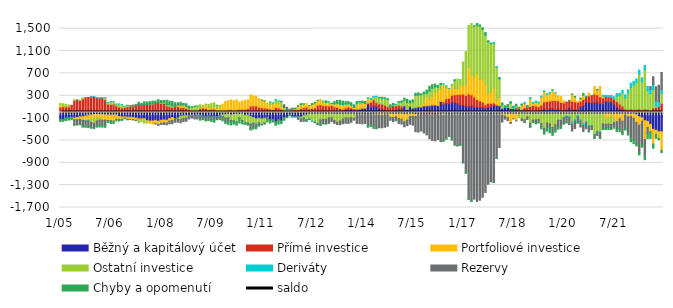
| Category | Běžný a kapitálový účet | Přímé investice | Portfoliové investice | Ostatní investice | Deriváty | Rezervy | Chyby a opomenutí |
|---|---|---|---|---|---|---|---|
| 2005-01-01 | -124.441 | 95.969 | 39.087 | 26.806 | -3.065 | -5.26 | -29.096 |
| 2005-02-01 | -122.296 | 106.451 | 15.114 | 35.964 | -2.865 | -3.918 | -28.449 |
| 2005-03-01 | -100.116 | 102.116 | 6.391 | 36.628 | -2.888 | -3.167 | -38.963 |
| 2005-04-01 | -90.744 | 102.48 | 2.986 | 29.42 | -4.783 | -6.772 | -32.587 |
| 2005-05-01 | -89.679 | 128.07 | -3.823 | -2.079 | -5.604 | -5.721 | -21.164 |
| 2005-06-01 | -96.933 | 213.928 | -31.807 | 14.9 | -7.103 | -88.045 | -4.94 |
| 2005-07-01 | -88.549 | 221.495 | -40.71 | -0.842 | -6.275 | -86.563 | 1.444 |
| 2005-08-01 | -77.137 | 212.773 | -43.483 | 6.714 | -6.537 | -89.944 | -2.386 |
| 2005-09-01 | -73.567 | 242.95 | -64.269 | 20.836 | -5.857 | -90.117 | -29.976 |
| 2005-10-01 | -62.91 | 265.013 | -77.21 | -7.197 | -4.649 | -90.105 | -22.942 |
| 2005-11-01 | -48.904 | 269.98 | -71.257 | -26.77 | -3.361 | -92.488 | -27.198 |
| 2005-12-01 | -44.466 | 279.63 | -81.187 | -52.224 | 0.188 | -92.851 | -9.091 |
| 2006-01-01 | -35.444 | 286.612 | -77.386 | -82.044 | 0.334 | -88.37 | -3.702 |
| 2006-02-01 | -32.147 | 261.427 | -60.913 | -57.207 | 0.355 | -92.35 | -19.166 |
| 2006-03-01 | -36.206 | 259.906 | -66.476 | -31.709 | 0.352 | -90.272 | -35.595 |
| 2006-04-01 | -38.805 | 261.891 | -82.916 | -18.61 | 0.424 | -86.38 | -35.603 |
| 2006-05-01 | -42.031 | 226.242 | -94.803 | 38.443 | 0.405 | -87.108 | -41.149 |
| 2006-06-01 | -44.576 | 146.85 | -99.523 | 30.924 | 0.366 | -5.548 | -28.492 |
| 2006-07-01 | -48.513 | 145.409 | -99.489 | 49.973 | 0.44 | -6.593 | -41.226 |
| 2006-08-01 | -46.557 | 148.445 | -108.886 | 47.854 | 0.452 | -6.15 | -35.158 |
| 2006-09-01 | -45.66 | 119.059 | -76.938 | 29.42 | 0.458 | -5.379 | -20.96 |
| 2006-10-01 | -73.871 | 97.411 | -49.213 | 54.007 | 0.541 | -7.077 | -21.796 |
| 2006-11-01 | -78.121 | 82.298 | -45.066 | 59.653 | 0.578 | -4.684 | -14.658 |
| 2006-12-01 | -75.212 | 90.262 | -26.882 | 20.925 | 0.679 | -2.075 | -7.696 |
| 2007-01-01 | -83.423 | 101.253 | -38.198 | 27.914 | 0.347 | -6.558 | -1.335 |
| 2007-02-01 | -84.812 | 110.884 | -37.352 | 5.205 | 0.448 | -0.928 | 6.556 |
| 2007-03-01 | -87.759 | 119.2 | -42.444 | 2.9 | 0.651 | -2.222 | 9.675 |
| 2007-04-01 | -98.952 | 125.496 | -20.046 | -24.529 | 0.603 | -1.944 | 19.374 |
| 2007-05-01 | -115.181 | 140.267 | -0.424 | -67.889 | 0.571 | 3.145 | 39.512 |
| 2007-06-01 | -111.686 | 132.066 | -13.346 | -38.819 | 0.383 | 5.255 | 26.147 |
| 2007-07-01 | -110.629 | 139.899 | -17.679 | -62.691 | 0.819 | 5.975 | 44.306 |
| 2007-08-01 | -145.936 | 146.494 | -28.978 | -12.535 | 0.999 | 3.072 | 36.885 |
| 2007-09-01 | -153.084 | 142.552 | -41.157 | 10.856 | 1.127 | 2.524 | 37.18 |
| 2007-10-01 | -151.952 | 148.301 | -52.926 | 6.14 | 1.324 | 1.454 | 47.66 |
| 2007-11-01 | -140.913 | 169.558 | -46.7 | -12.052 | 1.439 | -4.989 | 33.657 |
| 2007-12-01 | -155.189 | 179.064 | -58.258 | 4.625 | 1.297 | -15.666 | 44.127 |
| 2008-01-01 | -139.155 | 162.969 | -50.423 | 13.634 | 1.767 | -23.652 | 34.859 |
| 2008-02-01 | -132.842 | 162.76 | -50.101 | 16.257 | 2.075 | -32.474 | 34.324 |
| 2008-03-01 | -137.494 | 118.698 | -47.643 | 19.909 | 1.501 | -34.244 | 79.272 |
| 2008-04-01 | -107.244 | 104.523 | -43.151 | 34.588 | 1.689 | -53.309 | 62.904 |
| 2008-05-01 | -89.527 | 91.732 | -53.819 | 26.557 | 1.924 | -56.774 | 79.906 |
| 2008-06-01 | -112.332 | 113.068 | -1.37 | 0.386 | 3.156 | -60.286 | 57.377 |
| 2008-07-01 | -98.433 | 104.608 | 24.023 | -16.001 | 2.504 | -59.112 | 42.41 |
| 2008-08-01 | -65.04 | 85.821 | 43.933 | -59.607 | 1.553 | -59.348 | 52.687 |
| 2008-09-01 | -58.791 | 87.331 | 47.4 | -47.509 | 1.636 | -56.478 | 26.412 |
| 2008-10-01 | -56.607 | 74.424 | 35.608 | -41.803 | 1.578 | -57.768 | 44.569 |
| 2008-11-01 | -61.103 | 53.223 | -7.622 | 24.032 | -0.127 | -47.052 | 38.648 |
| 2008-12-01 | -49.23 | 36.327 | -9.146 | 58.766 | -2.607 | -40.111 | 6.001 |
| 2009-01-01 | -65.644 | 34.981 | -6.533 | 68.796 | -3.869 | -39.448 | 11.717 |
| 2009-02-01 | -47.079 | 33.476 | -5.426 | 82.017 | -5.137 | -59.391 | 1.54 |
| 2009-03-01 | -57.657 | 76.496 | 2.846 | 59.438 | -4.729 | -56.897 | -19.497 |
| 2009-04-01 | -63.743 | 78.011 | 16.979 | 33.12 | -4.444 | -45.707 | -14.217 |
| 2009-05-01 | -77.985 | 71.53 | 69.517 | 9.818 | -5.037 | -50.088 | -17.755 |
| 2009-06-01 | -65.636 | 52.724 | 37.762 | 54.86 | -5.444 | -45.396 | -28.868 |
| 2009-07-01 | -70.456 | 56.607 | 23.473 | 81.424 | -5.5 | -50.881 | -34.667 |
| 2009-08-01 | -75.834 | 60.436 | 37.65 | 75.148 | -4.999 | -42.508 | -49.894 |
| 2009-09-01 | -80.317 | 19.168 | 53.25 | 56.442 | -5.31 | -43.295 | 0.062 |
| 2009-10-01 | -50.64 | 16.017 | 84.549 | 27.42 | -6.32 | -44.017 | -27.01 |
| 2009-11-01 | -43.565 | 25.287 | 124.379 | -23.687 | -3.981 | -52.899 | -25.534 |
| 2009-12-01 | -37.928 | 37.694 | 158.688 | -62.101 | -1.288 | -60.646 | -34.419 |
| 2010-01-01 | -23.312 | 44.096 | 167.271 | -72.935 | -0.918 | -57.35 | -56.851 |
| 2010-02-01 | -44.444 | 51.441 | 172.535 | -96.436 | -0.658 | -24.165 | -58.272 |
| 2010-03-01 | -35.774 | 35.109 | 173.365 | -113.51 | -1.262 | -17.66 | -40.267 |
| 2010-04-01 | -24.486 | 40.28 | 186.135 | -146.14 | -1.347 | -8.814 | -45.628 |
| 2010-05-01 | -27.913 | 54.679 | 132.614 | -71.933 | -0.566 | -11.516 | -75.366 |
| 2010-06-01 | -7.947 | 56.225 | 148.714 | -133.05 | -0.789 | -14.791 | -48.362 |
| 2010-07-01 | -50.09 | 56.216 | 156.042 | -133.579 | -0.924 | -14.636 | -13.028 |
| 2010-08-01 | -47.156 | 67.767 | 158.203 | -138.067 | -1.091 | -27.99 | -11.666 |
| 2010-09-01 | -69.148 | 111 | 202.812 | -139.799 | -1.329 | -77.548 | -25.988 |
| 2010-10-01 | -89.776 | 119.635 | 177.882 | -101.974 | -1.563 | -68.884 | -35.32 |
| 2010-11-01 | -113.162 | 117.523 | 172.315 | -95.285 | -3.495 | -47.139 | -30.757 |
| 2010-12-01 | -104.18 | 94.99 | 150.353 | -76.832 | -4.748 | -41.425 | -18.159 |
| 2011-01-01 | -112.249 | 85.701 | 136.06 | -100.04 | -3.121 | -7.374 | 1.021 |
| 2011-02-01 | -102.287 | 80.335 | 127.736 | -86.588 | -1.586 | -18.566 | 0.957 |
| 2011-03-01 | -97.652 | 72.662 | 96.809 | -11.906 | -0.433 | -21.448 | -38.032 |
| 2011-04-01 | -124.856 | 61.899 | 72.974 | 51.933 | 1.134 | -23.294 | -39.792 |
| 2011-05-01 | -124.383 | 56.516 | 92.859 | 18.459 | 2.241 | -18.176 | -27.516 |
| 2011-06-01 | -164.887 | 90.626 | 76.627 | 58.552 | 4 | -20.423 | -44.494 |
| 2011-07-01 | -127.374 | 81.742 | 69.82 | 52.031 | 3.104 | -16.155 | -63.168 |
| 2011-08-01 | -144.867 | 61.807 | 42.247 | 93.574 | 1.908 | 0.029 | -54.698 |
| 2011-09-01 | -98.512 | 17.782 | -3.278 | 73.351 | 2.511 | 45.365 | -37.218 |
| 2011-10-01 | -81.308 | 12.681 | 0.923 | 40.645 | 2.323 | 36.939 | -12.202 |
| 2011-11-01 | -48.288 | 11.716 | 9.042 | 29.031 | -0.428 | 12.876 | -13.948 |
| 2011-12-01 | -72.091 | 46.805 | 5.781 | 8.622 | -3.673 | 17.23 | -2.673 |
| 2012-01-01 | -71.765 | 49.424 | 10.666 | 6.27 | -4.179 | -2.599 | 12.183 |
| 2012-02-01 | -79.424 | 50.592 | 59.164 | -10.81 | -1.836 | -30.201 | 12.516 |
| 2012-03-01 | -82.403 | 71.489 | 70.983 | -33.775 | -1.37 | -42.191 | 17.268 |
| 2012-04-01 | -55.856 | 83.434 | 66.434 | -42.772 | -3.649 | -55.377 | 7.786 |
| 2012-05-01 | -47.814 | 97.272 | 62.13 | -80.113 | -5.98 | -11.629 | -13.865 |
| 2012-06-01 | -4.534 | 68.001 | 56.551 | -107.547 | -9.458 | -4.086 | 1.074 |
| 2012-07-01 | -9.854 | 74.813 | 69.95 | -142.421 | -8.184 | 0.337 | 15.359 |
| 2012-08-01 | -2.597 | 81.568 | 85.993 | -168.212 | -6.378 | -6.409 | 16.036 |
| 2012-09-01 | -22.78 | 129.537 | 86.466 | -175.565 | -3.162 | -16.106 | 1.609 |
| 2012-10-01 | -1.424 | 136.501 | 94.815 | -133.195 | -0.024 | -82.175 | -14.498 |
| 2012-11-01 | -2.02 | 123.145 | 76.137 | -120.867 | 5.046 | -75.302 | -6.139 |
| 2012-12-01 | -10.302 | 121.261 | 54.848 | -115.942 | 8.618 | -80.474 | 21.991 |
| 2013-01-01 | -7.036 | 117.217 | 73.375 | -90.463 | 7.59 | -98.023 | -2.66 |
| 2013-02-01 | 13.966 | 112.128 | 32.087 | -96.088 | 4.273 | -69.024 | 2.658 |
| 2013-03-01 | -19.176 | 103.112 | 48.504 | -123.155 | 3.833 | -53.451 | 40.333 |
| 2013-04-01 | -22.668 | 92.047 | 70.258 | -153.123 | 4.515 | -39.026 | 47.997 |
| 2013-05-01 | -16.681 | 72.891 | 73.219 | -135.312 | 5.105 | -66.757 | 67.535 |
| 2013-06-01 | -14.434 | 56.612 | 80.987 | -104.838 | 7.726 | -82.522 | 56.469 |
| 2013-07-01 | 35.854 | 46.634 | 64.673 | -98.53 | 8.072 | -94.98 | 38.278 |
| 2013-08-01 | 51.942 | 44.252 | 54.412 | -101.583 | 8.101 | -94.924 | 37.8 |
| 2013-09-01 | 54.846 | 28.419 | 45.777 | -93.732 | 4.982 | -81.09 | 40.799 |
| 2013-10-01 | 48.645 | 15.299 | 26.09 | -107.167 | 4.064 | -30.204 | 43.272 |
| 2013-11-01 | 38.337 | 24.98 | 69.132 | 34.434 | 4.568 | -194.429 | 22.979 |
| 2013-12-01 | 60.652 | -7.438 | 92.838 | 29.747 | 4.737 | -188.191 | 7.655 |
| 2014-01-01 | 76.1 | -2.601 | 81.912 | 20.15 | 5.741 | -201.152 | 19.85 |
| 2014-02-01 | 70.566 | 5.975 | 83.668 | -2.356 | 6.611 | -193.752 | 29.287 |
| 2014-03-01 | 146.772 | 19.795 | 90.883 | -28.1 | 7.415 | -207.661 | -29.104 |
| 2014-04-01 | 97.569 | 89.191 | 38.21 | 15.421 | 7.724 | -221.599 | -26.516 |
| 2014-05-01 | 119.193 | 106.431 | 13.494 | 36.557 | 9.334 | -241.224 | -43.785 |
| 2014-06-01 | 110.206 | 67.369 | -37.704 | 107.195 | 6.478 | -247.349 | -6.196 |
| 2014-07-01 | 69.905 | 83.516 | -42.952 | 105.013 | 7.26 | -228.89 | 6.148 |
| 2014-08-01 | 61.301 | 89.081 | -46.649 | 98.871 | 7.601 | -226.61 | 16.406 |
| 2014-09-01 | 46.655 | 85.578 | -37.27 | 122.533 | 6.234 | -226.012 | 2.282 |
| 2014-10-01 | 30.752 | 74.779 | -35.586 | 125.857 | 5.434 | -211.155 | 9.917 |
| 2014-11-01 | 27.426 | 72.24 | -72.459 | -18.945 | 5.718 | -48.365 | 34.384 |
| 2014-12-01 | 40.201 | 80.383 | -90.269 | 13.368 | 6.046 | -73.123 | 23.393 |
| 2015-01-01 | 47.082 | 74.671 | -74.057 | 22.379 | 4.146 | -63.062 | -11.16 |
| 2015-02-01 | 64.438 | 63.07 | -107.527 | 58.027 | 3.488 | -90.114 | 8.619 |
| 2015-03-01 | 61.952 | 51.724 | -121.058 | 67.394 | 3.868 | -86.053 | 22.173 |
| 2015-04-01 | 117.258 | -33.411 | -136.96 | 101.367 | -1.045 | -84.552 | 37.342 |
| 2015-05-01 | 53.636 | -19.357 | -115.596 | 125.992 | -3.562 | -97.71 | 56.598 |
| 2015-06-01 | 105.409 | 7.387 | -74.673 | 59.418 | -1.026 | -134.52 | 38.005 |
| 2015-07-01 | 75.564 | -6.34 | -63.275 | 112.555 | -0.381 | -156.35 | 38.228 |
| 2015-08-01 | 86.554 | -32.895 | -37.812 | 220.111 | 0.717 | -272.248 | 35.573 |
| 2015-09-01 | 102.7 | -29.202 | 12.744 | 197.463 | 2.751 | -322.407 | 35.952 |
| 2015-10-01 | 100.512 | -18.347 | 30.053 | 184.876 | 3.704 | -313.861 | 13.064 |
| 2015-11-01 | 118.662 | -29.192 | 52.499 | 165.57 | 3.6 | -335.954 | 24.815 |
| 2015-12-01 | 119.739 | -49.748 | 164.135 | 58.735 | 4.77 | -351.305 | 53.675 |
| 2016-01-01 | 122.887 | -34.31 | 113.027 | 143.52 | 4.631 | -435.132 | 85.377 |
| 2016-02-01 | 133.482 | -32.742 | 156.301 | 141.674 | 3.924 | -465.391 | 62.751 |
| 2016-03-01 | 134.43 | -44.685 | 222.581 | 100.03 | 2.611 | -464.178 | 49.212 |
| 2016-04-01 | 120.546 | 4.787 | 244.565 | 80.345 | 6.325 | -484.676 | 28.108 |
| 2016-05-01 | 196.511 | -9.794 | 213.088 | 89.1 | 8.54 | -511.484 | 14.039 |
| 2016-06-01 | 140.692 | 49.487 | 317.438 | -56.509 | 6.54 | -452.936 | -4.712 |
| 2016-07-01 | 164.713 | 80.816 | 191.091 | 36.528 | 3.289 | -467.712 | -8.724 |
| 2016-08-01 | 163.423 | 93.491 | 171.964 | -12.524 | 0.488 | -414.993 | -1.85 |
| 2016-09-01 | 175.37 | 132.72 | 185.989 | -27.218 | 0.66 | -448.286 | -19.235 |
| 2016-10-01 | 180.263 | 136.956 | 113.705 | 140.399 | -0.733 | -586.443 | 15.854 |
| 2016-11-01 | 156.2 | 164.45 | 104.413 | 172.532 | -5.672 | -590.37 | -1.556 |
| 2016-12-01 | 136.832 | 186.549 | 169.532 | 96.615 | -11.291 | -563.521 | -14.716 |
| 2017-01-01 | 133.425 | 196.835 | 149.766 | 423.862 | -10.034 | -888.493 | -5.362 |
| 2017-02-01 | 115.392 | 192.45 | 194.217 | 586.242 | -11.159 | -1057.888 | -19.254 |
| 2017-03-01 | 107.276 | 225.107 | 478.723 | 748.319 | -11.446 | -1531.838 | -16.141 |
| 2017-04-01 | 121.608 | 193.727 | 352.524 | 924.831 | -11.77 | -1576.287 | -4.634 |
| 2017-05-01 | 97.526 | 178.028 | 359.538 | 905.362 | -7.82 | -1542.877 | 10.244 |
| 2017-06-01 | 98.913 | 133.395 | 464.482 | 861.543 | -6.072 | -1585.697 | 33.436 |
| 2017-07-01 | 91.96 | 114.079 | 387.829 | 950.666 | -1.827 | -1566.632 | 23.926 |
| 2017-08-01 | 88.999 | 95.116 | 416.824 | 887.727 | 3.503 | -1516.587 | 24.418 |
| 2017-09-01 | 80.144 | 60.1 | 362.621 | 880.447 | 1.883 | -1430.312 | 45.119 |
| 2017-10-01 | 92.476 | 74.539 | 165.793 | 932.479 | 1.516 | -1283.1 | 16.298 |
| 2017-11-01 | 100.507 | 62.307 | 198.477 | 867.092 | 6.534 | -1241.542 | 6.624 |
| 2017-12-01 | 124.017 | 45.857 | 268.263 | 802.453 | 14.19 | -1246.408 | -8.371 |
| 2018-01-01 | 127.634 | 6.897 | 85.198 | 586.914 | 15.506 | -816.481 | -5.669 |
| 2018-02-01 | 123.485 | -0.877 | 147.701 | 324.218 | 15.373 | -625.514 | 15.613 |
| 2018-03-01 | 73.836 | -12.224 | -35.723 | 56.884 | 14.998 | -123.043 | 25.27 |
| 2018-04-01 | 92.288 | -0.562 | -38.958 | -28.145 | 16.822 | -51.766 | 10.32 |
| 2018-05-01 | 91.283 | -0.015 | -95.024 | 3.631 | 14.49 | -48.998 | 34.633 |
| 2018-06-01 | 72.298 | 0.24 | -178.211 | 88.918 | 15.957 | -16.922 | 17.72 |
| 2018-07-01 | 72.65 | -2.901 | -109.351 | 8.241 | 13.683 | -1.887 | 19.565 |
| 2018-08-01 | 50.358 | 32.246 | -147.69 | 32.085 | 9.846 | -1.175 | 24.33 |
| 2018-09-01 | 40.95 | 37.543 | -25.179 | -68.693 | 9.468 | 2.892 | 3.018 |
| 2018-10-01 | 39.403 | 14.804 | 72.598 | -115.001 | 18.734 | -34.264 | 3.725 |
| 2018-11-01 | 51.333 | 33.354 | 74.852 | -129.911 | 20.707 | -47.993 | -2.342 |
| 2018-12-01 | 36.76 | 51.018 | -30.144 | -46.972 | 15.291 | -49.965 | 24.012 |
| 2019-01-01 | 31.57 | 75.792 | 142.991 | -189.865 | 16.341 | -57.395 | -19.434 |
| 2019-02-01 | 23.05 | 102.106 | 37.176 | -136.082 | 17.864 | -21.852 | -22.263 |
| 2019-03-01 | 24.522 | 92.305 | 68.003 | -134.07 | 17.873 | -53.612 | -15.022 |
| 2019-04-01 | 24.091 | 79.172 | 66.605 | -120.988 | 17.703 | -56.717 | -9.865 |
| 2019-05-01 | 40.757 | 91.071 | 148.036 | -195.892 | 15.443 | -55.871 | -43.544 |
| 2019-06-01 | 66.681 | 123.657 | 187.583 | -289.165 | 9.393 | -65.523 | -32.626 |
| 2019-07-01 | 50.102 | 147.67 | 127.163 | -187.977 | 9.416 | -82.791 | -63.584 |
| 2019-08-01 | 64.491 | 140.363 | 143.857 | -202.585 | 13.325 | -75.336 | -84.115 |
| 2019-09-01 | 72.03 | 142.336 | 180.599 | -268.704 | 14.68 | -93.118 | -47.822 |
| 2019-10-01 | 50.235 | 163.184 | 136.493 | -219.14 | 2.324 | -96.161 | -36.933 |
| 2019-11-01 | 60.867 | 147.339 | 90.165 | -135.905 | -2.587 | -111.748 | -48.129 |
| 2019-12-01 | 43.648 | 137.141 | 104.656 | -138.924 | -1.041 | -110.22 | -35.26 |
| 2020-01-01 | 30.944 | 143.12 | 35.897 | -89.592 | -7.146 | -98.813 | -14.409 |
| 2020-02-01 | 42.539 | 144.612 | -17.291 | -45.318 | -8.596 | -105.195 | -10.751 |
| 2020-03-01 | 84.8 | 126.071 | -1.306 | -70.484 | -24.849 | -121.242 | 7.011 |
| 2020-04-01 | 53.26 | 147.501 | 124.484 | -183.424 | -26.494 | -121.48 | 6.153 |
| 2020-05-01 | 49.414 | 142.47 | 83.546 | -129.384 | -28.165 | -130.596 | 12.715 |
| 2020-06-01 | 49.58 | 131.712 | 12.658 | -49.672 | -25.934 | -108.635 | -9.71 |
| 2020-07-01 | 99.522 | 98.381 | 45.495 | -124.877 | -29.591 | -105.268 | 16.338 |
| 2020-08-01 | 125.087 | 108.194 | 73.904 | -201.677 | -32.196 | -106.877 | 33.565 |
| 2020-09-01 | 185.846 | 83.831 | -33.084 | -126.343 | -23.943 | -107.331 | 21.024 |
| 2020-10-01 | 180.5 | 117.668 | 48.709 | -236.846 | -16.605 | -89.964 | -3.462 |
| 2020-11-01 | 174.305 | 129.558 | -24.34 | -205.834 | -13.97 | -62.27 | 2.552 |
| 2020-12-01 | 180.467 | 149.051 | 135.675 | -389.428 | -10.796 | -47.814 | -17.155 |
| 2021-01-01 | 186.304 | 130.078 | 85.63 | -334.945 | -16.516 | -62.761 | 12.21 |
| 2021-02-01 | 163.114 | 117.327 | 183.907 | -347.704 | -11.264 | -91.619 | -13.762 |
| 2021-03-01 | 156.728 | 102.73 | 33.392 | -205.248 | 13.582 | -85.987 | -15.196 |
| 2021-04-01 | 196.959 | 88.918 | -115.922 | -96.296 | 21.354 | -68.905 | -26.108 |
| 2021-05-01 | 185.811 | 91.655 | -103.267 | -101.399 | 26.058 | -58.469 | -40.389 |
| 2021-06-01 | 190.775 | 81.088 | -57.793 | -157.23 | 32.921 | -76.268 | -13.495 |
| 2021-07-01 | 151.111 | 88.977 | -108.996 | -72.004 | 41.657 | -71.329 | -29.417 |
| 2021-08-01 | 94.119 | 101.751 | -164.121 | 97.965 | 43.849 | -147.657 | -25.905 |
| 2021-09-01 | 57.501 | 94.588 | -112.111 | 150.417 | 39.608 | -173.463 | -56.54 |
| 2021-10-01 | 54.337 | 58.142 | -155.037 | 237.971 | 46.781 | -205.387 | -36.806 |
| 2021-11-01 | 31.178 | 31.355 | -42.087 | 200.734 | 51.508 | -239.511 | -33.179 |
| 2021-12-01 | 43.98 | 4.842 | -75.189 | 297.438 | 58.047 | -296.053 | -33.064 |
| 2022-01-01 | 27.14 | 34.18 | -67.861 | 392.004 | 69.233 | -381.055 | -73.641 |
| 2022-02-01 | 7.77 | 44.594 | -102.18 | 435.774 | 69.678 | -393.021 | -62.615 |
| 2022-03-01 | -39.662 | 54.686 | -136.897 | 479.819 | 65.198 | -385.999 | -37.145 |
| 2022-04-01 | -75.42 | 61.621 | -152.207 | 631.097 | 66.118 | -490.719 | -40.489 |
| 2022-05-01 | -95.06 | 51.63 | -59.926 | 498.812 | 70.59 | -411.86 | -54.185 |
| 2022-06-01 | -146.401 | 61.74 | -337.415 | 705.852 | 74.958 | -283.153 | -75.581 |
| 2022-07-01 | -157.477 | 54.237 | -110.27 | 336.124 | 75.765 | -116.117 | -82.262 |
| 2022-08-01 | -210.698 | 29.026 | -131.474 | 309.519 | 75.669 | 50.002 | -122.044 |
| 2022-09-01 | -300.341 | 77.87 | -264.506 | 332.922 | 91.69 | 137.07 | -74.705 |
| 2022-10-01 | -316.904 | 88.706 | -70.424 | 25.254 | 92.724 | 254.301 | -73.656 |
| 2022-11-01 | -342.817 | 102.704 | -117.191 | -3.303 | 86.327 | 299.884 | -25.604 |
| 2022-12-01 | -343.543 | 161.745 | -332.951 | 188.187 | 59.897 | 307.149 | -40.483 |